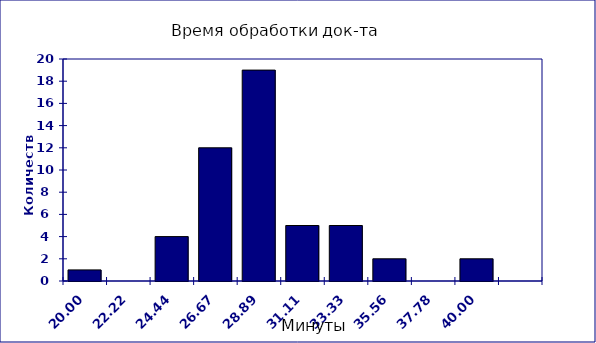
| Category | Frequency |
|---|---|
| 20.00 | 1 |
| 22.22 | 0 |
| 24.44 | 4 |
| 26.67 | 12 |
| 28.89 | 19 |
| 31.11 | 5 |
| 33.33 | 5 |
| 35.56 | 2 |
| 37.78 | 0 |
| 40.00 | 2 |